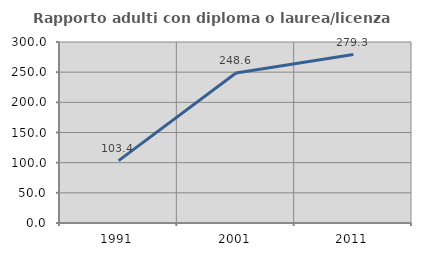
| Category | Rapporto adulti con diploma o laurea/licenza media  |
|---|---|
| 1991.0 | 103.421 |
| 2001.0 | 248.64 |
| 2011.0 | 279.277 |